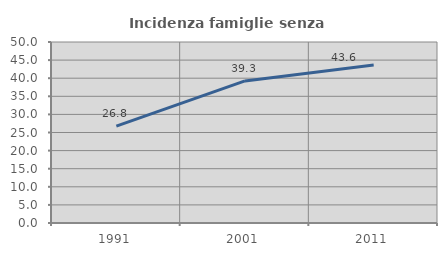
| Category | Incidenza famiglie senza nuclei |
|---|---|
| 1991.0 | 26.771 |
| 2001.0 | 39.255 |
| 2011.0 | 43.649 |